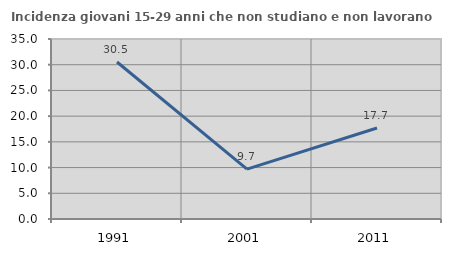
| Category | Incidenza giovani 15-29 anni che non studiano e non lavorano  |
|---|---|
| 1991.0 | 30.531 |
| 2001.0 | 9.705 |
| 2011.0 | 17.69 |